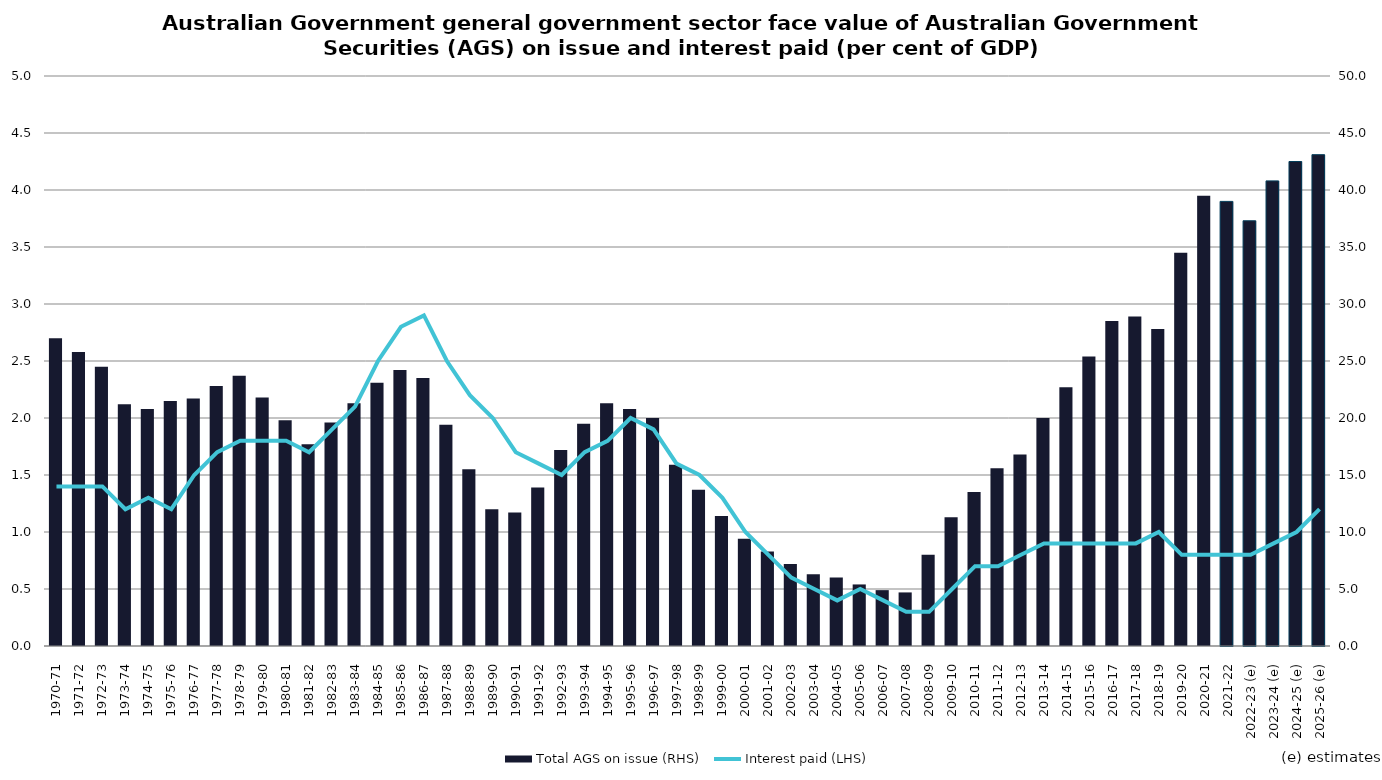
| Category | Total AGS on issue (RHS) |
|---|---|
| 1970-71 | 27 |
| 1971-72 | 25.8 |
| 1972-73 | 24.5 |
| 1973-74 | 21.2 |
| 1974-75 | 20.8 |
| 1975-76 | 21.5 |
| 1976-77 | 21.7 |
| 1977-78 | 22.8 |
| 1978-79 | 23.7 |
| 1979-80 | 21.8 |
| 1980-81 | 19.8 |
| 1981-82 | 17.7 |
| 1982-83 | 19.6 |
| 1983-84 | 21.3 |
| 1984-85 | 23.1 |
| 1985-86 | 24.2 |
| 1986-87 | 23.5 |
| 1987-88 | 19.4 |
| 1988-89 | 15.5 |
| 1989-90 | 12 |
| 1990-91 | 11.7 |
| 1991-92 | 13.9 |
| 1992-93 | 17.2 |
| 1993-94 | 19.5 |
| 1994-95 | 21.3 |
| 1995-96 | 20.8 |
| 1996-97 | 20 |
| 1997-98 | 15.9 |
| 1998-99 | 13.7 |
| 1999-00 | 11.4 |
| 2000-01 | 9.4 |
| 2001-02 | 8.3 |
| 2002-03 | 7.2 |
| 2003-04 | 6.3 |
| 2004-05 | 6 |
| 2005-06 | 5.4 |
| 2006-07 | 4.9 |
| 2007-08 | 4.7 |
| 2008-09 | 8 |
| 2009-10 | 11.3 |
| 2010-11 | 13.5 |
| 2011-12 | 15.6 |
| 2012-13 | 16.8 |
| 2013-14 | 20 |
| 2014-15 | 22.7 |
| 2015-16 | 25.4 |
| 2016-17 | 28.5 |
| 2017-18 | 28.9 |
| 2018-19 | 27.8 |
| 2019-20 | 34.5 |
| 2020-21 (e) | 39.5 |
| 2021-22 (e) | 39 |
| 2022-23 (e) | 37.3 |
| 2023-24 (e) | 40.8 |